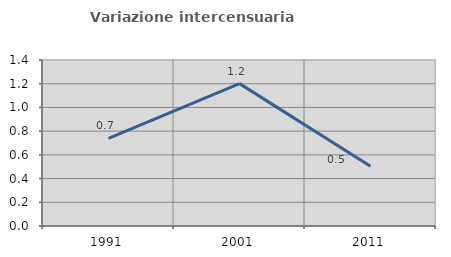
| Category | Variazione intercensuaria annua |
|---|---|
| 1991.0 | 0.739 |
| 2001.0 | 1.201 |
| 2011.0 | 0.504 |